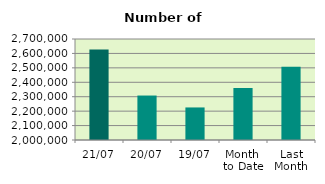
| Category | Series 0 |
|---|---|
| 21/07 | 2626986 |
| 20/07 | 2308148 |
| 19/07 | 2225626 |
| Month 
to Date | 2361134.4 |
| Last
Month | 2507488.545 |